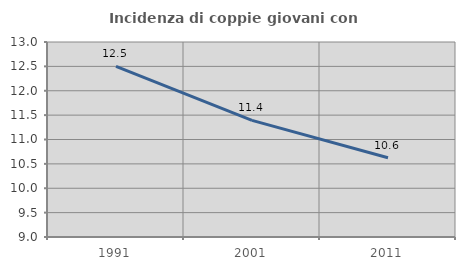
| Category | Incidenza di coppie giovani con figli |
|---|---|
| 1991.0 | 12.5 |
| 2001.0 | 11.392 |
| 2011.0 | 10.625 |